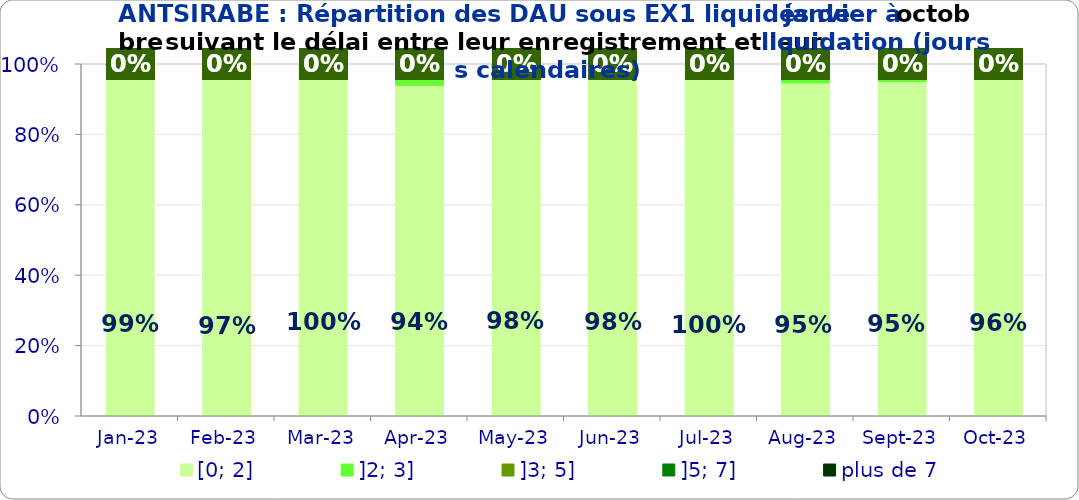
| Category | [0; 2] | ]2; 3] | ]3; 5] | ]5; 7] | plus de 7 |
|---|---|---|---|---|---|
| 2023-01-01 | 0.994 | 0 | 0.006 | 0 | 0 |
| 2023-02-01 | 0.97 | 0.03 | 0 | 0 | 0 |
| 2023-03-01 | 1 | 0 | 0 | 0 | 0 |
| 2023-04-01 | 0.938 | 0.062 | 0 | 0 | 0 |
| 2023-05-01 | 0.981 | 0.006 | 0.013 | 0 | 0 |
| 2023-06-01 | 0.98 | 0.02 | 0 | 0 | 0 |
| 2023-07-01 | 1 | 0 | 0 | 0 | 0 |
| 2023-08-01 | 0.945 | 0.055 | 0 | 0 | 0 |
| 2023-09-01 | 0.949 | 0.051 | 0 | 0 | 0 |
| 2023-10-01 | 0.957 | 0.034 | 0.009 | 0 | 0 |